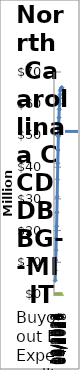
| Category | Projected Expenditures | Actual Expenditure |
|---|---|---|
| 10/2022 | 4285000 | 0 |
| 01/2023 | 7467700 | 0 |
| 04/2023 | 10650400 | 0 |
| 07/2023 | 13833100 | 0 |
| 10/2023 | 17546250 | 0 |
| 01/2024 | 21370794.5 | 0 |
| 04/2024 | 25741702.5 | 0 |
| 07/2024 | 30658974 | 0 |
| 10/2024 | 36122609 | 0 |
| 01/2025 | 41187398.645 | 0 |
| 04/2025 | 45408056.682 | 0 |
| 07/2025 | 49628714.72 | 0 |
| 10/2025 | 53005241.15 | 0 |
| 01/2026 | 55613607.817 | 0 |
| 04/2026 | 58221974.484 | 0 |
| 07/2026 | 59960885.596 | 0 |
| 10/2026 | 61699796.707 | 0 |
| 01/2027 | 62893849.004 | 0 |
| 04/2027 | 64087901.3 | 0 |
| 07/2027 | 64386414.374 | 0 |
| 10/2027 | 64625224.834 | 0 |
| 01/2028 | 64864035.293 | 0 |
| 04/2028 | 64983440.523 | 0 |
| 07/2028 | 65117399.752 | 0 |